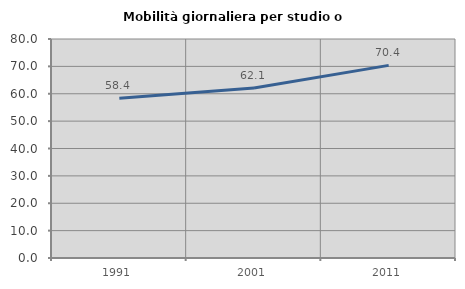
| Category | Mobilità giornaliera per studio o lavoro |
|---|---|
| 1991.0 | 58.388 |
| 2001.0 | 62.132 |
| 2011.0 | 70.364 |